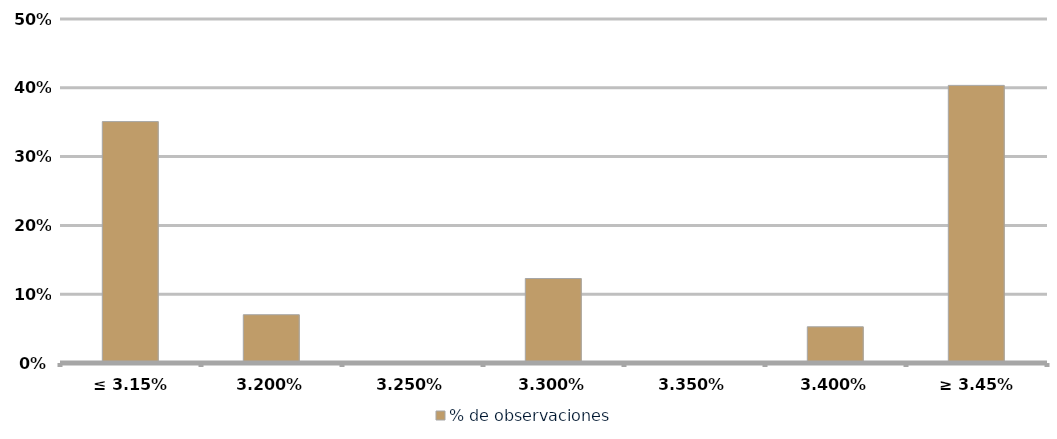
| Category | % de observaciones  |
|---|---|
| ≤ 3.15% | 0.351 |
| 3.20% | 0.07 |
| 3.25% | 0 |
| 3.30% | 0.123 |
| 3.35% | 0 |
| 3.40% | 0.053 |
| ≥ 3.45% | 0.404 |